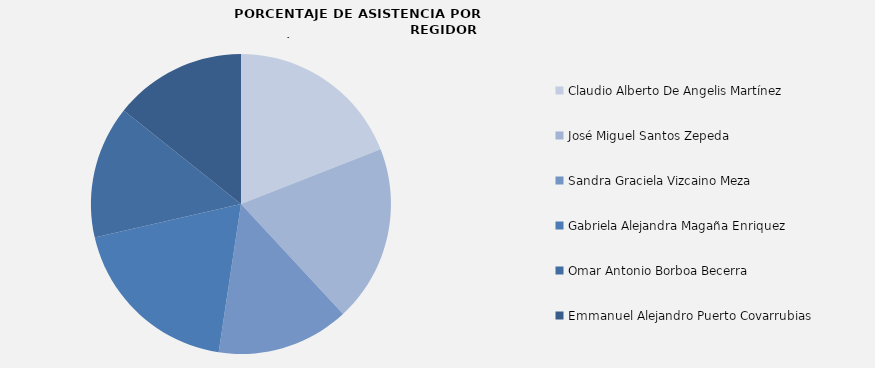
| Category | Series 0 |
|---|---|
| Claudio Alberto De Angelis Martínez | 100 |
| José Miguel Santos Zepeda | 100 |
| Sandra Graciela Vizcaino Meza | 75 |
| Gabriela Alejandra Magaña Enriquez | 100 |
| Omar Antonio Borboa Becerra | 75 |
| Emmanuel Alejandro Puerto Covarrubias | 75 |